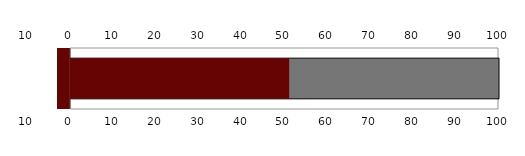
| Category | Series 2 | Series 3 |
|---|---|---|
| 0 | -3 | 110 |